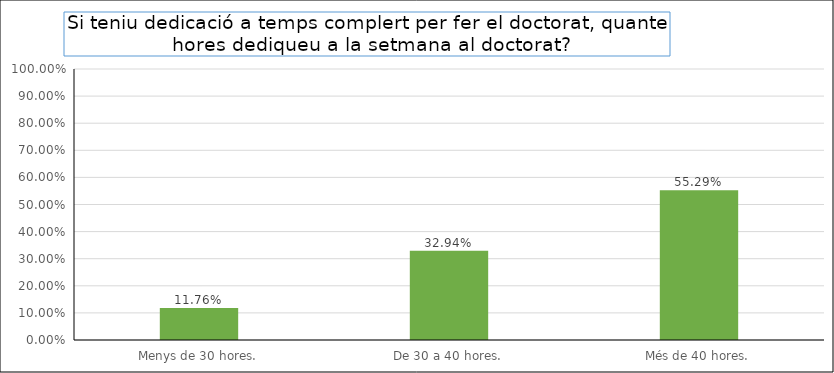
| Category | Series 0 |
|---|---|
| Menys de 30 hores. | 0.118 |
| De 30 a 40 hores. | 0.329 |
| Més de 40 hores. | 0.553 |